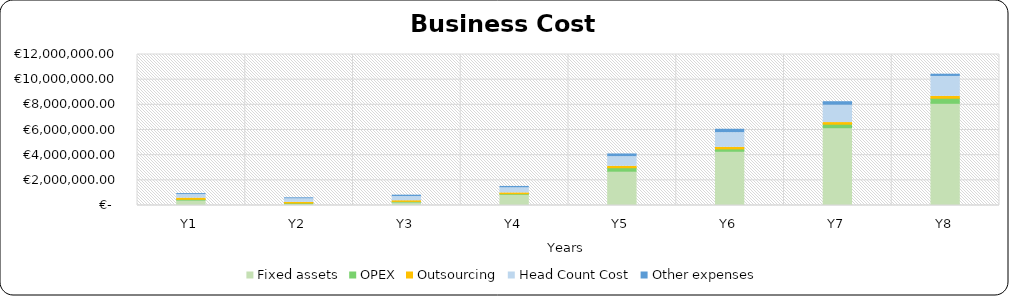
| Category | Fixed assets | OPEX | Outsourcing | Head Count Cost | Other expenses |
|---|---|---|---|---|---|
| 0 | 429800 | 62547.41 | 92600 | 283920 | 78400 |
| 1 | 140800 | 54289.5 | 52400 | 283920 | 79600 |
| 2 | 274600 | 52054.944 | 52400 | 333060 | 109600 |
| 3 | 885600 | 50775.028 | 65850 | 403260 | 109600 |
| 4 | 2726800 | 274850.913 | 114050 | 767130 | 214050 |
| 5 | 4310600 | 187318.346 | 123000 | 1169610 | 268400 |
| 6 | 6180700 | 279288.819 | 131000 | 1375920 | 280700 |
| 7 | 8121350 | 403162.332 | 147000 | 1583400 | 180350 |